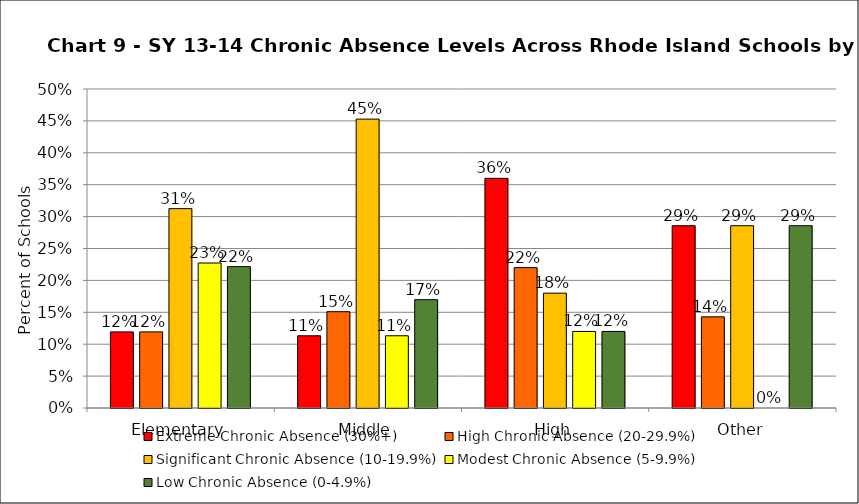
| Category | Extreme Chronic Absence (30%+) | High Chronic Absence (20-29.9%) | Significant Chronic Absence (10-19.9%) | Modest Chronic Absence (5-9.9%) | Low Chronic Absence (0-4.9%) |
|---|---|---|---|---|---|
| 0 | 0.119 | 0.119 | 0.312 | 0.227 | 0.222 |
| 1 | 0.113 | 0.151 | 0.453 | 0.113 | 0.17 |
| 2 | 0.36 | 0.22 | 0.18 | 0.12 | 0.12 |
| 3 | 0.286 | 0.143 | 0.286 | 0 | 0.286 |